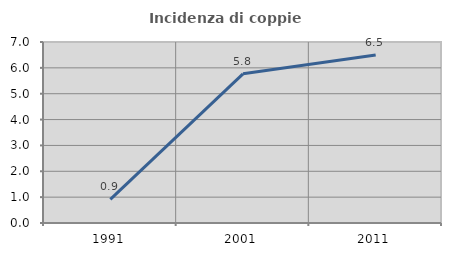
| Category | Incidenza di coppie miste |
|---|---|
| 1991.0 | 0.913 |
| 2001.0 | 5.769 |
| 2011.0 | 6.5 |